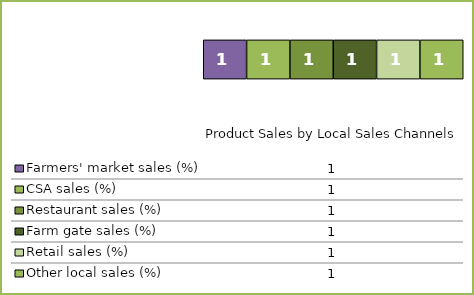
| Category | Farmers' market sales (%) | CSA sales (%) | Restaurant sales (%) | Farm gate sales (%) | Retail sales (%) | Other local sales (%) |
|---|---|---|---|---|---|---|
| 0 | 1 | 1 | 1 | 1 | 1 | 1 |